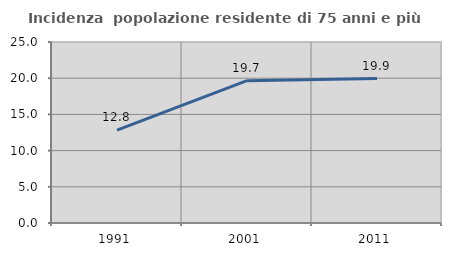
| Category | Incidenza  popolazione residente di 75 anni e più |
|---|---|
| 1991.0 | 12.821 |
| 2001.0 | 19.653 |
| 2011.0 | 19.942 |